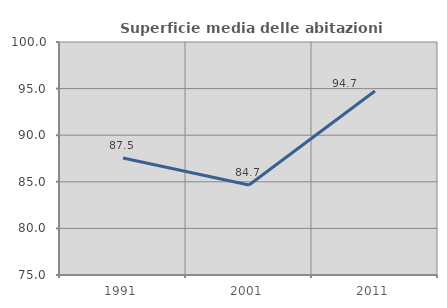
| Category | Superficie media delle abitazioni occupate |
|---|---|
| 1991.0 | 87.544 |
| 2001.0 | 84.656 |
| 2011.0 | 94.741 |